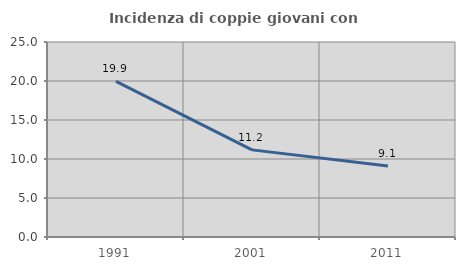
| Category | Incidenza di coppie giovani con figli |
|---|---|
| 1991.0 | 19.945 |
| 2001.0 | 11.169 |
| 2011.0 | 9.113 |